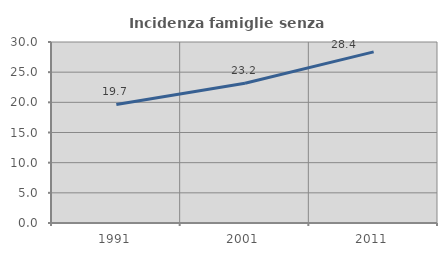
| Category | Incidenza famiglie senza nuclei |
|---|---|
| 1991.0 | 19.657 |
| 2001.0 | 23.175 |
| 2011.0 | 28.362 |